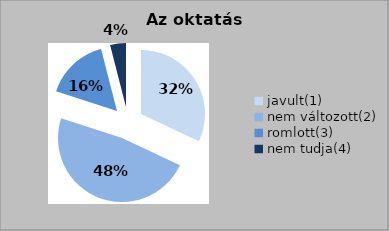
| Category | Series 0 | Series 1 |
|---|---|---|
| javult(1) | 8 | 32 |
| nem változott(2) | 12 | 48 |
| romlott(3) | 4 | 16 |
| nem tudja(4) | 1 | 4 |